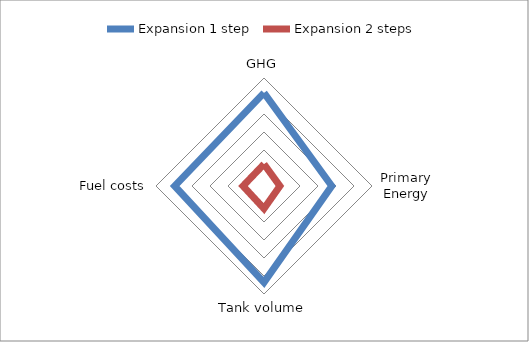
| Category | Expansion 1 step | Expansion 2 steps |
|---|---|---|
| GHG | 25.872 | 6.076 |
| Primary Energy | 18.82 | 4.42 |
| Tank volume | 26.764 | 6.286 |
| Fuel costs | 24.821 | 5.829 |